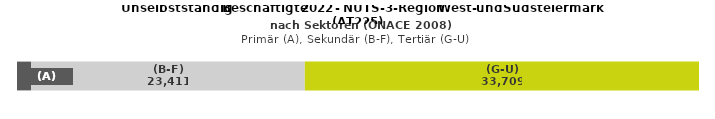
| Category | (A) | (B-F) | (G-U) |
|---|---|---|---|
| 0 | 1201 | 23411 | 33709 |